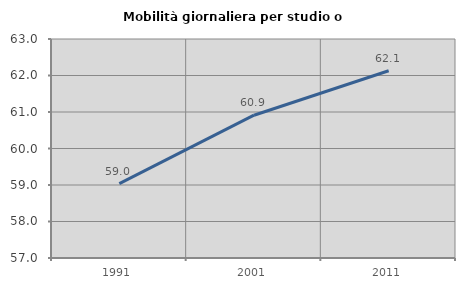
| Category | Mobilità giornaliera per studio o lavoro |
|---|---|
| 1991.0 | 59.039 |
| 2001.0 | 60.912 |
| 2011.0 | 62.13 |